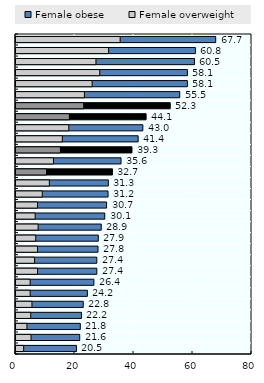
| Category | Female obese | Female overweight |
|---|---|---|
| Fiji | 67.7 | 35.3 |
| New Zealand | 60.8 | 31.4 |
| Solomon Islands | 60.5 | 27.1 |
| Australia | 58.1 | 28.4 |
| Papua New Guinea | 58.1 | 25.8 |
| Mongolia | 55.5 | 23.2 |
| OECD | 52.283 | 22.937 |
| Asia Pacific-UM | 44.1 | 18.1 |
| Malaysia | 43 | 17.9 |
| Brunei Darussalam | 41.4 | 15.7 |
| Asia Pacific-H | 39.317 | 15.05 |
| Thailand | 35.6 | 12.7 |
| Asia Pacific-LM/L | 32.707 | 10.353 |
| Pakistan | 31.3 | 11.3 |
| Indonesia | 31.2 | 8.9 |
| Korea, DPR | 30.7 | 7.3 |
| China | 30.1 | 6.5 |
| Philippines | 28.9 | 7.5 |
| Lao PDR | 27.9 | 6.7 |
| Myanmar | 27.8 | 7.3 |
| Singapore | 27.4 | 6.3 |
| Sri Lanka | 27.4 | 7.3 |
| Korea, Rep. | 26.4 | 4.8 |
| Cambodia | 24.2 | 4.8 |
| Nepal | 22.8 | 5.4 |
| Bangladesh | 22.2 | 5 |
| Japan | 21.8 | 3.7 |
| India | 21.6 | 5.1 |
| Viet Nam | 20.5 | 2.6 |